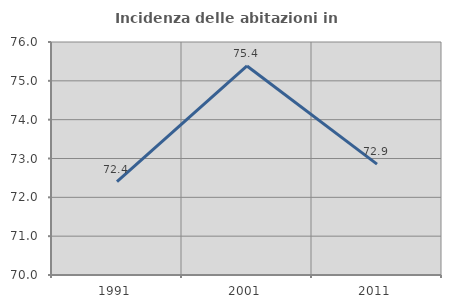
| Category | Incidenza delle abitazioni in proprietà  |
|---|---|
| 1991.0 | 72.403 |
| 2001.0 | 75.384 |
| 2011.0 | 72.855 |